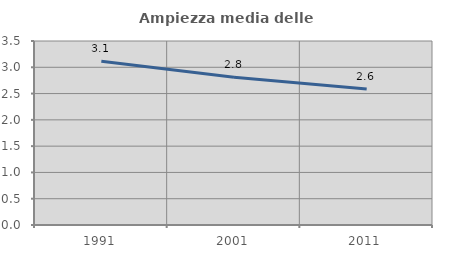
| Category | Ampiezza media delle famiglie |
|---|---|
| 1991.0 | 3.113 |
| 2001.0 | 2.812 |
| 2011.0 | 2.586 |